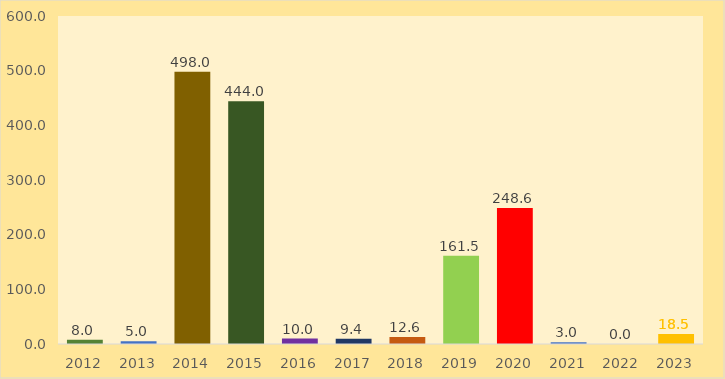
| Category | Dividendi |
|---|---|
| 2012.0 | 8 |
| 2013.0 | 5 |
| 2014.0 | 498 |
| 2015.0 | 444 |
| 2016.0 | 10 |
| 2017.0 | 9.4 |
| 2018.0 | 12.62 |
| 2019.0 | 161.49 |
| 2020.0 | 248.57 |
| 2021.0 | 2.99 |
| 2022.0 | 0.03 |
| 2023.0 | 18.5 |